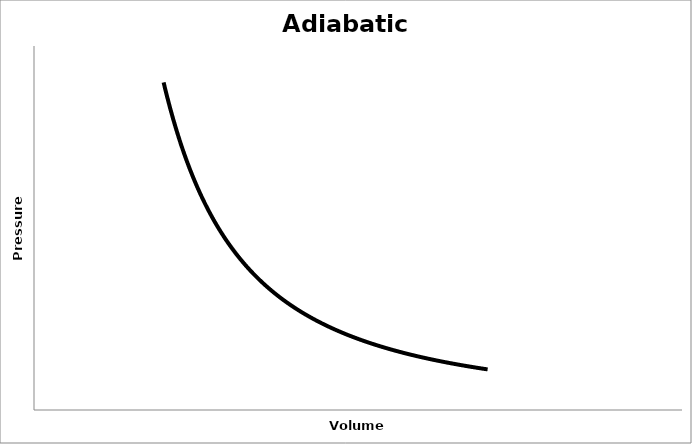
| Category | Series 0 |
|---|---|
| 2.0 | 9 |
| 2.05 | 8.637 |
| 2.0999999999999996 | 8.297 |
| 2.1499999999999995 | 7.978 |
| 2.1999999999999993 | 7.678 |
| 2.249999999999999 | 7.396 |
| 2.299999999999999 | 7.13 |
| 2.3499999999999988 | 6.879 |
| 2.3999999999999986 | 6.642 |
| 2.4499999999999984 | 6.417 |
| 2.4999999999999982 | 6.205 |
| 2.549999999999998 | 6.003 |
| 2.599999999999998 | 5.812 |
| 2.6499999999999977 | 5.631 |
| 2.6999999999999975 | 5.458 |
| 2.7499999999999973 | 5.293 |
| 2.799999999999997 | 5.137 |
| 2.849999999999997 | 4.988 |
| 2.899999999999997 | 4.845 |
| 2.9499999999999966 | 4.709 |
| 2.9999999999999964 | 4.579 |
| 3.0499999999999963 | 4.454 |
| 3.099999999999996 | 4.335 |
| 3.149999999999996 | 4.221 |
| 3.1999999999999957 | 4.112 |
| 3.2499999999999956 | 4.007 |
| 3.2999999999999954 | 3.906 |
| 3.349999999999995 | 3.81 |
| 3.399999999999995 | 3.717 |
| 3.449999999999995 | 3.627 |
| 3.4999999999999947 | 3.541 |
| 3.5499999999999945 | 3.459 |
| 3.5999999999999943 | 3.379 |
| 3.649999999999994 | 3.302 |
| 3.699999999999994 | 3.228 |
| 3.749999999999994 | 3.157 |
| 3.7999999999999936 | 3.088 |
| 3.8499999999999934 | 3.021 |
| 3.8999999999999932 | 2.957 |
| 3.949999999999993 | 2.895 |
| 3.999999999999993 | 2.835 |
| 4.049999999999993 | 2.777 |
| 4.0999999999999925 | 2.721 |
| 4.149999999999992 | 2.666 |
| 4.199999999999992 | 2.613 |
| 4.249999999999992 | 2.562 |
| 4.299999999999992 | 2.513 |
| 4.349999999999992 | 2.465 |
| 4.3999999999999915 | 2.418 |
| 4.449999999999991 | 2.373 |
| 4.499999999999991 | 2.33 |
| 4.549999999999991 | 2.287 |
| 4.599999999999991 | 2.246 |
| 4.649999999999991 | 2.206 |
| 4.69999999999999 | 2.167 |
| 4.74999999999999 | 2.129 |
| 4.79999999999999 | 2.092 |
| 4.84999999999999 | 2.056 |
| 4.89999999999999 | 2.021 |
| 4.9499999999999895 | 1.987 |
| 4.999999999999989 | 1.954 |
| 5.049999999999989 | 1.922 |
| 5.099999999999989 | 1.891 |
| 5.149999999999989 | 1.86 |
| 5.199999999999989 | 1.831 |
| 5.2499999999999885 | 1.802 |
| 5.299999999999988 | 1.774 |
| 5.349999999999988 | 1.746 |
| 5.399999999999988 | 1.719 |
| 5.449999999999988 | 1.693 |
| 5.499999999999988 | 1.667 |
| 5.549999999999987 | 1.642 |
| 5.599999999999987 | 1.618 |
| 5.649999999999987 | 1.594 |
| 5.699999999999987 | 1.571 |
| 5.749999999999987 | 1.548 |
| 5.7999999999999865 | 1.526 |
| 5.849999999999986 | 1.504 |
| 5.899999999999986 | 1.483 |
| 5.949999999999986 | 1.463 |
| 5.999999999999986 | 1.442 |
| 6.049999999999986 | 1.422 |
| 6.099999999999985 | 1.403 |
| 6.149999999999985 | 1.384 |
| 6.199999999999985 | 1.366 |
| 6.249999999999985 | 1.347 |
| 6.299999999999985 | 1.33 |
| 6.3499999999999845 | 1.312 |
| 6.399999999999984 | 1.295 |
| 6.449999999999984 | 1.278 |
| 6.499999999999984 | 1.262 |
| 6.549999999999984 | 1.246 |
| 6.599999999999984 | 1.23 |
| 6.6499999999999835 | 1.215 |
| 6.699999999999983 | 1.2 |
| 6.749999999999983 | 1.185 |
| 6.799999999999983 | 1.171 |
| 6.849999999999983 | 1.156 |
| 6.899999999999983 | 1.143 |
| 6.949999999999982 | 1.129 |
| 6.999999999999982 | 1.115 |